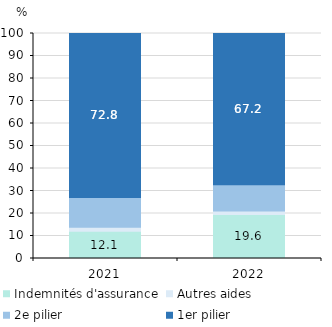
| Category | Indemnités d'assurance | Autres aides | 2e pilier | 1er pilier |
|---|---|---|---|---|
| 0 | 12.111 | 1.752 | 13.294 | 72.843 |
| 1 | 19.566 | 1.514 | 11.735 | 67.185 |